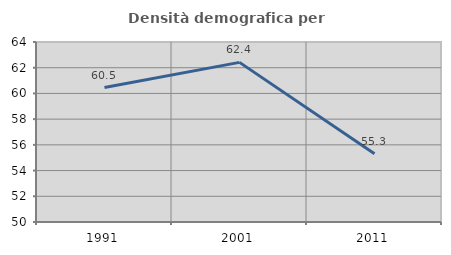
| Category | Densità demografica |
|---|---|
| 1991.0 | 60.457 |
| 2001.0 | 62.415 |
| 2011.0 | 55.313 |